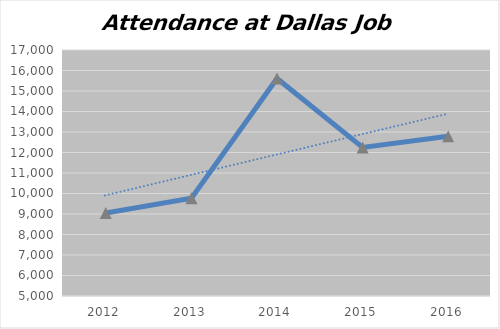
| Category | Dallas |
|---|---|
| 2012 | 9049 |
| 2013 | 9774 |
| 2014 | 15613 |
| 2015 | 12245 |
| 2016 | 12788 |